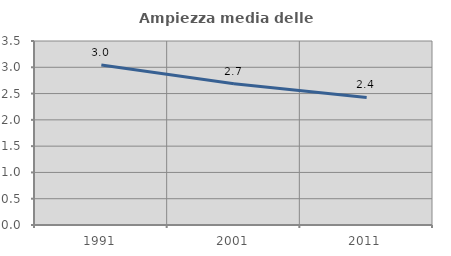
| Category | Ampiezza media delle famiglie |
|---|---|
| 1991.0 | 3.043 |
| 2001.0 | 2.689 |
| 2011.0 | 2.426 |